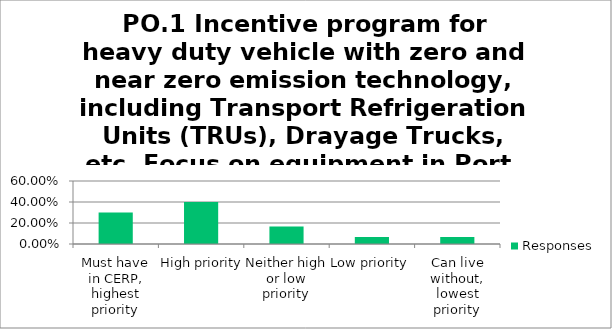
| Category | Responses |
|---|---|
| Must have in CERP, highest priority | 0.3 |
| High priority | 0.4 |
| Neither high or low priority | 0.167 |
| Low priority | 0.067 |
| Can live without, lowest priority | 0.067 |